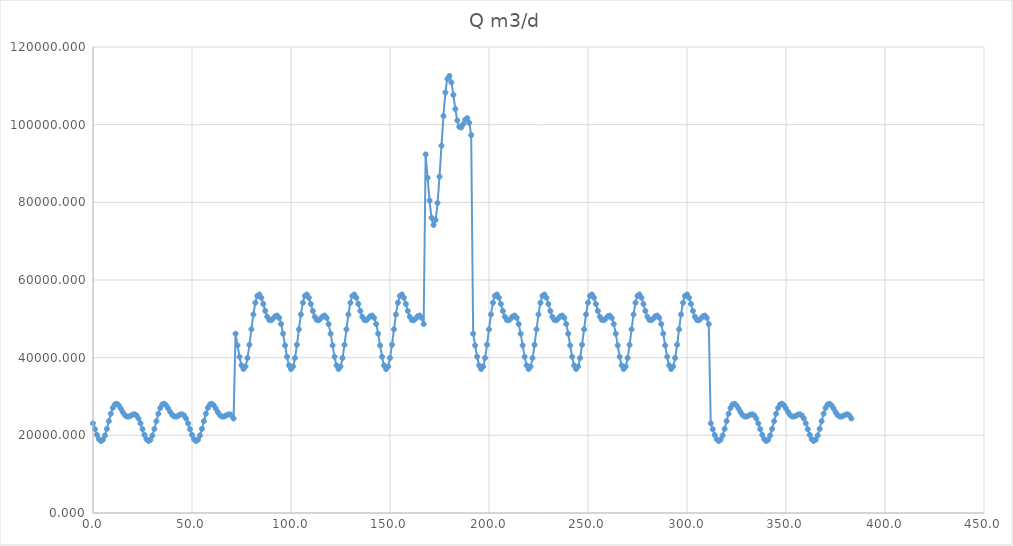
| Category | Q |
|---|---|
| 0.0 | 23084.502 |
| 1.0 | 21581.129 |
| 2.0 | 20112.819 |
| 3.0 | 19006.413 |
| 4.0 | 18538.096 |
| 5.0 | 18860.78 |
| 6.0 | 19961.257 |
| 7.0 | 21658.75 |
| 8.0 | 23645.574 |
| 9.0 | 25559.553 |
| 10.0 | 27069.466 |
| 11.0 | 27951.42 |
| 12.0 | 28136.527 |
| 13.0 | 27717.954 |
| 14.0 | 26916.23 |
| 15.0 | 26012.768 |
| 16.0 | 25269.925 |
| 17.0 | 24859.318 |
| 18.0 | 24817.715 |
| 19.0 | 25042.167 |
| 20.0 | 25325.377 |
| 21.0 | 25421.266 |
| 22.0 | 25122.513 |
| 23.0 | 24328.482 |
| 24.0 | 23084.502 |
| 25.0 | 21581.129 |
| 26.0 | 20112.819 |
| 27.0 | 19006.413 |
| 28.0 | 18538.096 |
| 29.0 | 18860.78 |
| 30.0 | 19961.257 |
| 31.0 | 21658.75 |
| 32.0 | 23645.574 |
| 33.0 | 25559.553 |
| 34.0 | 27069.466 |
| 35.0 | 27951.42 |
| 36.0 | 28136.527 |
| 37.0 | 27717.954 |
| 38.0 | 26916.23 |
| 39.0 | 26012.768 |
| 40.0 | 25269.925 |
| 41.0 | 24859.318 |
| 42.0 | 24817.715 |
| 43.0 | 25042.167 |
| 44.0 | 25325.377 |
| 45.0 | 25421.266 |
| 46.0 | 25122.513 |
| 47.0 | 24328.482 |
| 48.0 | 23084.502 |
| 49.0 | 21581.129 |
| 50.0 | 20112.819 |
| 51.0 | 19006.413 |
| 52.0 | 18538.096 |
| 53.0 | 18860.78 |
| 54.0 | 19961.257 |
| 55.0 | 21658.75 |
| 56.0 | 23645.574 |
| 57.0 | 25559.553 |
| 58.0 | 27069.466 |
| 59.0 | 27951.42 |
| 60.0 | 28136.527 |
| 61.0 | 27717.954 |
| 62.0 | 26916.23 |
| 63.0 | 26012.768 |
| 64.0 | 25269.925 |
| 65.0 | 24859.318 |
| 66.0 | 24817.715 |
| 67.0 | 25042.167 |
| 68.0 | 25325.377 |
| 69.0 | 25421.266 |
| 70.0 | 25122.513 |
| 71.0 | 24328.482 |
| 72.0 | 46169.004 |
| 73.0 | 43162.258 |
| 74.0 | 40225.639 |
| 75.0 | 38012.826 |
| 76.0 | 37076.193 |
| 77.0 | 37721.56 |
| 78.0 | 39922.514 |
| 79.0 | 43317.499 |
| 80.0 | 47291.147 |
| 81.0 | 51119.106 |
| 82.0 | 54138.932 |
| 83.0 | 55902.84 |
| 84.0 | 56273.053 |
| 85.0 | 55435.908 |
| 86.0 | 53832.46 |
| 87.0 | 52025.536 |
| 88.0 | 50539.849 |
| 89.0 | 49718.636 |
| 90.0 | 49635.429 |
| 91.0 | 50084.334 |
| 92.0 | 50650.754 |
| 93.0 | 50842.532 |
| 94.0 | 50245.026 |
| 95.0 | 48656.964 |
| 96.0 | 46169.004 |
| 97.0 | 43162.258 |
| 98.0 | 40225.639 |
| 99.0 | 38012.826 |
| 100.0 | 37076.193 |
| 101.0 | 37721.56 |
| 102.0 | 39922.514 |
| 103.0 | 43317.499 |
| 104.0 | 47291.147 |
| 105.0 | 51119.106 |
| 106.0 | 54138.932 |
| 107.0 | 55902.84 |
| 108.0 | 56273.053 |
| 109.0 | 55435.908 |
| 110.0 | 53832.46 |
| 111.0 | 52025.536 |
| 112.0 | 50539.849 |
| 113.0 | 49718.636 |
| 114.0 | 49635.429 |
| 115.0 | 50084.334 |
| 116.0 | 50650.754 |
| 117.0 | 50842.532 |
| 118.0 | 50245.026 |
| 119.0 | 48656.964 |
| 120.0 | 46169.004 |
| 121.0 | 43162.258 |
| 122.0 | 40225.639 |
| 123.0 | 38012.826 |
| 124.0 | 37076.193 |
| 125.0 | 37721.56 |
| 126.0 | 39922.514 |
| 127.0 | 43317.499 |
| 128.0 | 47291.147 |
| 129.0 | 51119.106 |
| 130.0 | 54138.932 |
| 131.0 | 55902.84 |
| 132.0 | 56273.053 |
| 133.0 | 55435.908 |
| 134.0 | 53832.46 |
| 135.0 | 52025.536 |
| 136.0 | 50539.849 |
| 137.0 | 49718.636 |
| 138.0 | 49635.429 |
| 139.0 | 50084.334 |
| 140.0 | 50650.754 |
| 141.0 | 50842.532 |
| 142.0 | 50245.026 |
| 143.0 | 48656.964 |
| 144.0 | 46169.004 |
| 145.0 | 43162.258 |
| 146.0 | 40225.639 |
| 147.0 | 38012.826 |
| 148.0 | 37076.193 |
| 149.0 | 37721.56 |
| 150.0 | 39922.514 |
| 151.0 | 43317.499 |
| 152.0 | 47291.147 |
| 153.0 | 51119.106 |
| 154.0 | 54138.932 |
| 155.0 | 55902.84 |
| 156.0 | 56273.053 |
| 157.0 | 55435.908 |
| 158.0 | 53832.46 |
| 159.0 | 52025.536 |
| 160.0 | 50539.849 |
| 161.0 | 49718.636 |
| 162.0 | 49635.429 |
| 163.0 | 50084.334 |
| 164.0 | 50650.754 |
| 165.0 | 50842.532 |
| 166.0 | 50245.026 |
| 167.0 | 48656.964 |
| 168.0 | 92338.007 |
| 169.0 | 86324.516 |
| 170.0 | 80451.277 |
| 171.0 | 76025.652 |
| 172.0 | 74152.386 |
| 173.0 | 75443.12 |
| 174.0 | 79845.028 |
| 175.0 | 86634.999 |
| 176.0 | 94582.295 |
| 177.0 | 102238.212 |
| 178.0 | 108277.864 |
| 179.0 | 111805.679 |
| 180.0 | 112546.107 |
| 181.0 | 110871.816 |
| 182.0 | 107664.92 |
| 183.0 | 104051.073 |
| 184.0 | 101079.698 |
| 185.0 | 99437.272 |
| 186.0 | 99270.858 |
| 187.0 | 100168.669 |
| 188.0 | 101301.507 |
| 189.0 | 101685.064 |
| 190.0 | 100490.052 |
| 191.0 | 97313.928 |
| 192.0 | 46169.004 |
| 193.0 | 43162.258 |
| 194.0 | 40225.639 |
| 195.0 | 38012.826 |
| 196.0 | 37076.193 |
| 197.0 | 37721.56 |
| 198.0 | 39922.514 |
| 199.0 | 43317.499 |
| 200.0 | 47291.147 |
| 201.0 | 51119.106 |
| 202.0 | 54138.932 |
| 203.0 | 55902.84 |
| 204.0 | 56273.053 |
| 205.0 | 55435.908 |
| 206.0 | 53832.46 |
| 207.0 | 52025.536 |
| 208.0 | 50539.849 |
| 209.0 | 49718.636 |
| 210.0 | 49635.429 |
| 211.0 | 50084.334 |
| 212.0 | 50650.754 |
| 213.0 | 50842.532 |
| 214.0 | 50245.026 |
| 215.0 | 48656.964 |
| 216.0 | 46169.004 |
| 217.0 | 43162.258 |
| 218.0 | 40225.639 |
| 219.0 | 38012.826 |
| 220.0 | 37076.193 |
| 221.0 | 37721.56 |
| 222.0 | 39922.514 |
| 223.0 | 43317.499 |
| 224.0 | 47291.147 |
| 225.0 | 51119.106 |
| 226.0 | 54138.932 |
| 227.0 | 55902.84 |
| 228.0 | 56273.053 |
| 229.0 | 55435.908 |
| 230.0 | 53832.46 |
| 231.0 | 52025.536 |
| 232.0 | 50539.849 |
| 233.0 | 49718.636 |
| 234.0 | 49635.429 |
| 235.0 | 50084.334 |
| 236.0 | 50650.754 |
| 237.0 | 50842.532 |
| 238.0 | 50245.026 |
| 239.0 | 48656.964 |
| 240.0 | 46169.004 |
| 241.0 | 43162.258 |
| 242.0 | 40225.639 |
| 243.0 | 38012.826 |
| 244.0 | 37076.193 |
| 245.0 | 37721.56 |
| 246.0 | 39922.514 |
| 247.0 | 43317.499 |
| 248.0 | 47291.147 |
| 249.0 | 51119.106 |
| 250.0 | 54138.932 |
| 251.0 | 55902.84 |
| 252.0 | 56273.053 |
| 253.0 | 55435.908 |
| 254.0 | 53832.46 |
| 255.0 | 52025.536 |
| 256.0 | 50539.849 |
| 257.0 | 49718.636 |
| 258.0 | 49635.429 |
| 259.0 | 50084.334 |
| 260.0 | 50650.754 |
| 261.0 | 50842.532 |
| 262.0 | 50245.026 |
| 263.0 | 48656.964 |
| 264.0 | 46169.004 |
| 265.0 | 43162.258 |
| 266.0 | 40225.639 |
| 267.0 | 38012.826 |
| 268.0 | 37076.193 |
| 269.0 | 37721.56 |
| 270.0 | 39922.514 |
| 271.0 | 43317.499 |
| 272.0 | 47291.147 |
| 273.0 | 51119.106 |
| 274.0 | 54138.932 |
| 275.0 | 55902.84 |
| 276.0 | 56273.053 |
| 277.0 | 55435.908 |
| 278.0 | 53832.46 |
| 279.0 | 52025.536 |
| 280.0 | 50539.849 |
| 281.0 | 49718.636 |
| 282.0 | 49635.429 |
| 283.0 | 50084.334 |
| 284.0 | 50650.754 |
| 285.0 | 50842.532 |
| 286.0 | 50245.026 |
| 287.0 | 48656.964 |
| 288.0 | 46169.004 |
| 289.0 | 43162.258 |
| 290.0 | 40225.639 |
| 291.0 | 38012.826 |
| 292.0 | 37076.193 |
| 293.0 | 37721.56 |
| 294.0 | 39922.514 |
| 295.0 | 43317.499 |
| 296.0 | 47291.147 |
| 297.0 | 51119.106 |
| 298.0 | 54138.932 |
| 299.0 | 55902.84 |
| 300.0 | 56273.053 |
| 301.0 | 55435.908 |
| 302.0 | 53832.46 |
| 303.0 | 52025.536 |
| 304.0 | 50539.849 |
| 305.0 | 49718.636 |
| 306.0 | 49635.429 |
| 307.0 | 50084.334 |
| 308.0 | 50650.754 |
| 309.0 | 50842.532 |
| 310.0 | 50245.026 |
| 311.0 | 48656.964 |
| 312.0 | 23084.502 |
| 313.0 | 21581.129 |
| 314.0 | 20112.819 |
| 315.0 | 19006.413 |
| 316.0 | 18538.096 |
| 317.0 | 18860.78 |
| 318.0 | 19961.257 |
| 319.0 | 21658.75 |
| 320.0 | 23645.574 |
| 321.0 | 25559.553 |
| 322.0 | 27069.466 |
| 323.0 | 27951.42 |
| 324.0 | 28136.527 |
| 325.0 | 27717.954 |
| 326.0 | 26916.23 |
| 327.0 | 26012.768 |
| 328.0 | 25269.925 |
| 329.0 | 24859.318 |
| 330.0 | 24817.715 |
| 331.0 | 25042.167 |
| 332.0 | 25325.377 |
| 333.0 | 25421.266 |
| 334.0 | 25122.513 |
| 335.0 | 24328.482 |
| 336.0 | 23084.502 |
| 337.0 | 21581.129 |
| 338.0 | 20112.819 |
| 339.0 | 19006.413 |
| 340.0 | 18538.096 |
| 341.0 | 18860.78 |
| 342.0 | 19961.257 |
| 343.0 | 21658.75 |
| 344.0 | 23645.574 |
| 345.0 | 25559.553 |
| 346.0 | 27069.466 |
| 347.0 | 27951.42 |
| 348.0 | 28136.527 |
| 349.0 | 27717.954 |
| 350.0 | 26916.23 |
| 351.0 | 26012.768 |
| 352.0 | 25269.925 |
| 353.0 | 24859.318 |
| 354.0 | 24817.715 |
| 355.0 | 25042.167 |
| 356.0 | 25325.377 |
| 357.0 | 25421.266 |
| 358.0 | 25122.513 |
| 359.0 | 24328.482 |
| 360.0 | 23084.502 |
| 361.0 | 21581.129 |
| 362.0 | 20112.819 |
| 363.0 | 19006.413 |
| 364.0 | 18538.096 |
| 365.0 | 18860.78 |
| 366.0 | 19961.257 |
| 367.0 | 21658.75 |
| 368.0 | 23645.574 |
| 369.0 | 25559.553 |
| 370.0 | 27069.466 |
| 371.0 | 27951.42 |
| 372.0 | 28136.527 |
| 373.0 | 27717.954 |
| 374.0 | 26916.23 |
| 375.0 | 26012.768 |
| 376.0 | 25269.925 |
| 377.0 | 24859.318 |
| 378.0 | 24817.715 |
| 379.0 | 25042.167 |
| 380.0 | 25325.377 |
| 381.0 | 25421.266 |
| 382.0 | 25122.513 |
| 383.0 | 24328.482 |